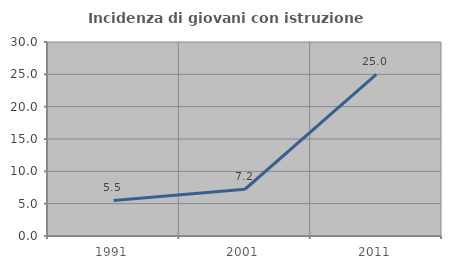
| Category | Incidenza di giovani con istruzione universitaria |
|---|---|
| 1991.0 | 5.495 |
| 2001.0 | 7.229 |
| 2011.0 | 25 |